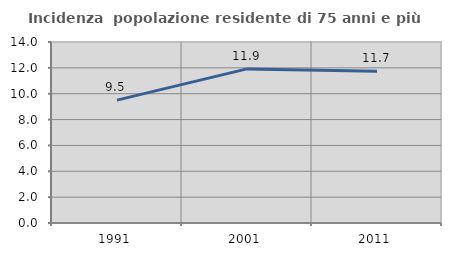
| Category | Incidenza  popolazione residente di 75 anni e più |
|---|---|
| 1991.0 | 9.507 |
| 2001.0 | 11.92 |
| 2011.0 | 11.734 |